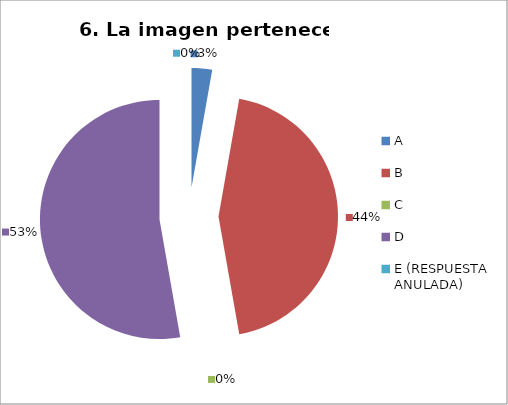
| Category | CANTIDAD DE RESPUESTAS PREGUNTA (6) | PORCENTAJE |
|---|---|---|
| A | 1 | 0.028 |
| B | 16 | 0.444 |
| C | 0 | 0 |
| D | 19 | 0.528 |
| E (RESPUESTA ANULADA) | 0 | 0 |